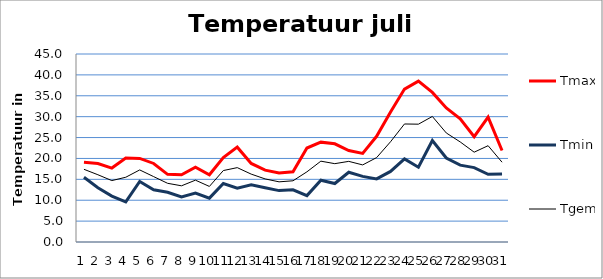
| Category | Tmax | Tmin | Tgem |
|---|---|---|---|
| 0 | 19.1 | 15.5 | 17.4 |
| 1 | 18.8 | 13 | 16.1 |
| 2 | 17.7 | 11 | 14.7 |
| 3 | 20.1 | 9.6 | 15.5 |
| 4 | 20 | 14.5 | 17.25 |
| 5 | 18.8 | 12.5 | 15.65 |
| 6 | 16.2 | 11.9 | 14.05 |
| 7 | 16.1 | 10.8 | 13.45 |
| 8 | 17.9 | 11.7 | 14.8 |
| 9 | 16.1 | 10.5 | 13.3 |
| 10 | 20.2 | 14 | 17.1 |
| 11 | 22.7 | 12.9 | 17.8 |
| 12 | 18.8 | 13.7 | 16.25 |
| 13 | 17.2 | 13 | 15.1 |
| 14 | 16.5 | 12.3 | 14.4 |
| 15 | 16.8 | 12.5 | 14.65 |
| 16 | 22.5 | 11.1 | 16.8 |
| 17 | 23.9 | 14.8 | 19.35 |
| 18 | 23.5 | 14 | 18.75 |
| 19 | 21.9 | 16.7 | 19.3 |
| 20 | 21.2 | 15.7 | 18.45 |
| 21 | 25.3 | 15.1 | 20.2 |
| 22 | 31.1 | 16.9 | 24 |
| 23 | 36.6 | 19.9 | 28.25 |
| 24 | 38.5 | 17.9 | 28.2 |
| 25 | 35.8 | 24.3 | 30.05 |
| 26 | 32.1 | 20.1 | 26.1 |
| 27 | 29.5 | 18.4 | 23.95 |
| 28 | 25.2 | 17.8 | 21.5 |
| 29 | 29.9 | 16.2 | 23.05 |
| 30 | 21.9 | 16.3 | 19.1 |